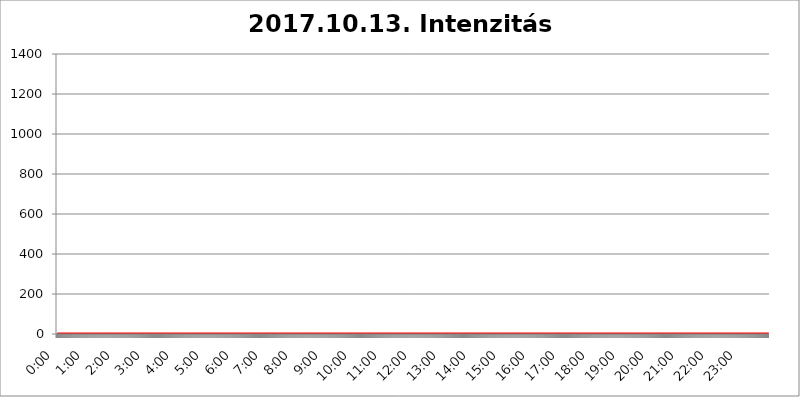
| Category | 2017.10.13. Intenzitás [W/m^2] |
|---|---|
| 0.0 | 0 |
| 0.0006944444444444445 | 0 |
| 0.001388888888888889 | 0 |
| 0.0020833333333333333 | 0 |
| 0.002777777777777778 | 0 |
| 0.003472222222222222 | 0 |
| 0.004166666666666667 | 0 |
| 0.004861111111111111 | 0 |
| 0.005555555555555556 | 0 |
| 0.0062499999999999995 | 0 |
| 0.006944444444444444 | 0 |
| 0.007638888888888889 | 0 |
| 0.008333333333333333 | 0 |
| 0.009027777777777779 | 0 |
| 0.009722222222222222 | 0 |
| 0.010416666666666666 | 0 |
| 0.011111111111111112 | 0 |
| 0.011805555555555555 | 0 |
| 0.012499999999999999 | 0 |
| 0.013194444444444444 | 0 |
| 0.013888888888888888 | 0 |
| 0.014583333333333332 | 0 |
| 0.015277777777777777 | 0 |
| 0.015972222222222224 | 0 |
| 0.016666666666666666 | 0 |
| 0.017361111111111112 | 0 |
| 0.018055555555555557 | 0 |
| 0.01875 | 0 |
| 0.019444444444444445 | 0 |
| 0.02013888888888889 | 0 |
| 0.020833333333333332 | 0 |
| 0.02152777777777778 | 0 |
| 0.022222222222222223 | 0 |
| 0.02291666666666667 | 0 |
| 0.02361111111111111 | 0 |
| 0.024305555555555556 | 0 |
| 0.024999999999999998 | 0 |
| 0.025694444444444447 | 0 |
| 0.02638888888888889 | 0 |
| 0.027083333333333334 | 0 |
| 0.027777777777777776 | 0 |
| 0.02847222222222222 | 0 |
| 0.029166666666666664 | 0 |
| 0.029861111111111113 | 0 |
| 0.030555555555555555 | 0 |
| 0.03125 | 0 |
| 0.03194444444444445 | 0 |
| 0.03263888888888889 | 0 |
| 0.03333333333333333 | 0 |
| 0.034027777777777775 | 0 |
| 0.034722222222222224 | 0 |
| 0.035416666666666666 | 0 |
| 0.036111111111111115 | 0 |
| 0.03680555555555556 | 0 |
| 0.0375 | 0 |
| 0.03819444444444444 | 0 |
| 0.03888888888888889 | 0 |
| 0.03958333333333333 | 0 |
| 0.04027777777777778 | 0 |
| 0.04097222222222222 | 0 |
| 0.041666666666666664 | 0 |
| 0.042361111111111106 | 0 |
| 0.04305555555555556 | 0 |
| 0.043750000000000004 | 0 |
| 0.044444444444444446 | 0 |
| 0.04513888888888889 | 0 |
| 0.04583333333333334 | 0 |
| 0.04652777777777778 | 0 |
| 0.04722222222222222 | 0 |
| 0.04791666666666666 | 0 |
| 0.04861111111111111 | 0 |
| 0.049305555555555554 | 0 |
| 0.049999999999999996 | 0 |
| 0.05069444444444445 | 0 |
| 0.051388888888888894 | 0 |
| 0.052083333333333336 | 0 |
| 0.05277777777777778 | 0 |
| 0.05347222222222222 | 0 |
| 0.05416666666666667 | 0 |
| 0.05486111111111111 | 0 |
| 0.05555555555555555 | 0 |
| 0.05625 | 0 |
| 0.05694444444444444 | 0 |
| 0.057638888888888885 | 0 |
| 0.05833333333333333 | 0 |
| 0.05902777777777778 | 0 |
| 0.059722222222222225 | 0 |
| 0.06041666666666667 | 0 |
| 0.061111111111111116 | 0 |
| 0.06180555555555556 | 0 |
| 0.0625 | 0 |
| 0.06319444444444444 | 0 |
| 0.06388888888888888 | 0 |
| 0.06458333333333334 | 0 |
| 0.06527777777777778 | 0 |
| 0.06597222222222222 | 0 |
| 0.06666666666666667 | 0 |
| 0.06736111111111111 | 0 |
| 0.06805555555555555 | 0 |
| 0.06874999999999999 | 0 |
| 0.06944444444444443 | 0 |
| 0.07013888888888889 | 0 |
| 0.07083333333333333 | 0 |
| 0.07152777777777779 | 0 |
| 0.07222222222222223 | 0 |
| 0.07291666666666667 | 0 |
| 0.07361111111111111 | 0 |
| 0.07430555555555556 | 0 |
| 0.075 | 0 |
| 0.07569444444444444 | 0 |
| 0.0763888888888889 | 0 |
| 0.07708333333333334 | 0 |
| 0.07777777777777778 | 0 |
| 0.07847222222222222 | 0 |
| 0.07916666666666666 | 0 |
| 0.0798611111111111 | 0 |
| 0.08055555555555556 | 0 |
| 0.08125 | 0 |
| 0.08194444444444444 | 0 |
| 0.08263888888888889 | 0 |
| 0.08333333333333333 | 0 |
| 0.08402777777777777 | 0 |
| 0.08472222222222221 | 0 |
| 0.08541666666666665 | 0 |
| 0.08611111111111112 | 0 |
| 0.08680555555555557 | 0 |
| 0.08750000000000001 | 0 |
| 0.08819444444444445 | 0 |
| 0.08888888888888889 | 0 |
| 0.08958333333333333 | 0 |
| 0.09027777777777778 | 0 |
| 0.09097222222222222 | 0 |
| 0.09166666666666667 | 0 |
| 0.09236111111111112 | 0 |
| 0.09305555555555556 | 0 |
| 0.09375 | 0 |
| 0.09444444444444444 | 0 |
| 0.09513888888888888 | 0 |
| 0.09583333333333333 | 0 |
| 0.09652777777777777 | 0 |
| 0.09722222222222222 | 0 |
| 0.09791666666666667 | 0 |
| 0.09861111111111111 | 0 |
| 0.09930555555555555 | 0 |
| 0.09999999999999999 | 0 |
| 0.10069444444444443 | 0 |
| 0.1013888888888889 | 0 |
| 0.10208333333333335 | 0 |
| 0.10277777777777779 | 0 |
| 0.10347222222222223 | 0 |
| 0.10416666666666667 | 0 |
| 0.10486111111111111 | 0 |
| 0.10555555555555556 | 0 |
| 0.10625 | 0 |
| 0.10694444444444444 | 0 |
| 0.1076388888888889 | 0 |
| 0.10833333333333334 | 0 |
| 0.10902777777777778 | 0 |
| 0.10972222222222222 | 0 |
| 0.1111111111111111 | 0 |
| 0.11180555555555556 | 0 |
| 0.11180555555555556 | 0 |
| 0.1125 | 0 |
| 0.11319444444444444 | 0 |
| 0.11388888888888889 | 0 |
| 0.11458333333333333 | 0 |
| 0.11527777777777777 | 0 |
| 0.11597222222222221 | 0 |
| 0.11666666666666665 | 0 |
| 0.1173611111111111 | 0 |
| 0.11805555555555557 | 0 |
| 0.11944444444444445 | 0 |
| 0.12013888888888889 | 0 |
| 0.12083333333333333 | 0 |
| 0.12152777777777778 | 0 |
| 0.12222222222222223 | 0 |
| 0.12291666666666667 | 0 |
| 0.12291666666666667 | 0 |
| 0.12361111111111112 | 0 |
| 0.12430555555555556 | 0 |
| 0.125 | 0 |
| 0.12569444444444444 | 0 |
| 0.12638888888888888 | 0 |
| 0.12708333333333333 | 0 |
| 0.16875 | 0 |
| 0.12847222222222224 | 0 |
| 0.12916666666666668 | 0 |
| 0.12986111111111112 | 0 |
| 0.13055555555555556 | 0 |
| 0.13125 | 0 |
| 0.13194444444444445 | 0 |
| 0.1326388888888889 | 0 |
| 0.13333333333333333 | 0 |
| 0.13402777777777777 | 0 |
| 0.13402777777777777 | 0 |
| 0.13472222222222222 | 0 |
| 0.13541666666666666 | 0 |
| 0.1361111111111111 | 0 |
| 0.13749999999999998 | 0 |
| 0.13819444444444443 | 0 |
| 0.1388888888888889 | 0 |
| 0.13958333333333334 | 0 |
| 0.14027777777777778 | 0 |
| 0.14097222222222222 | 0 |
| 0.14166666666666666 | 0 |
| 0.1423611111111111 | 0 |
| 0.14305555555555557 | 0 |
| 0.14375000000000002 | 0 |
| 0.14444444444444446 | 0 |
| 0.1451388888888889 | 0 |
| 0.1451388888888889 | 0 |
| 0.14652777777777778 | 0 |
| 0.14722222222222223 | 0 |
| 0.14791666666666667 | 0 |
| 0.1486111111111111 | 0 |
| 0.14930555555555555 | 0 |
| 0.15 | 0 |
| 0.15069444444444444 | 0 |
| 0.15138888888888888 | 0 |
| 0.15208333333333332 | 0 |
| 0.15277777777777776 | 0 |
| 0.15347222222222223 | 0 |
| 0.15416666666666667 | 0 |
| 0.15486111111111112 | 0 |
| 0.15555555555555556 | 0 |
| 0.15625 | 0 |
| 0.15694444444444444 | 0 |
| 0.15763888888888888 | 0 |
| 0.15833333333333333 | 0 |
| 0.15902777777777777 | 0 |
| 0.15972222222222224 | 0 |
| 0.16041666666666668 | 0 |
| 0.16111111111111112 | 0 |
| 0.16180555555555556 | 0 |
| 0.1625 | 0 |
| 0.16319444444444445 | 0 |
| 0.1638888888888889 | 0 |
| 0.16458333333333333 | 0 |
| 0.16527777777777777 | 0 |
| 0.16597222222222222 | 0 |
| 0.16666666666666666 | 0 |
| 0.1673611111111111 | 0 |
| 0.16805555555555554 | 0 |
| 0.16874999999999998 | 0 |
| 0.16944444444444443 | 0 |
| 0.17013888888888887 | 0 |
| 0.1708333333333333 | 0 |
| 0.17152777777777775 | 0 |
| 0.17222222222222225 | 0 |
| 0.1729166666666667 | 0 |
| 0.17361111111111113 | 0 |
| 0.17430555555555557 | 0 |
| 0.17500000000000002 | 0 |
| 0.17569444444444446 | 0 |
| 0.1763888888888889 | 0 |
| 0.17708333333333334 | 0 |
| 0.17777777777777778 | 0 |
| 0.17847222222222223 | 0 |
| 0.17916666666666667 | 0 |
| 0.1798611111111111 | 0 |
| 0.18055555555555555 | 0 |
| 0.18125 | 0 |
| 0.18194444444444444 | 0 |
| 0.1826388888888889 | 0 |
| 0.18333333333333335 | 0 |
| 0.1840277777777778 | 0 |
| 0.18472222222222223 | 0 |
| 0.18541666666666667 | 0 |
| 0.18611111111111112 | 0 |
| 0.18680555555555556 | 0 |
| 0.1875 | 0 |
| 0.18819444444444444 | 0 |
| 0.18888888888888888 | 0 |
| 0.18958333333333333 | 0 |
| 0.19027777777777777 | 0 |
| 0.1909722222222222 | 0 |
| 0.19166666666666665 | 0 |
| 0.19236111111111112 | 0 |
| 0.19305555555555554 | 0 |
| 0.19375 | 0 |
| 0.19444444444444445 | 0 |
| 0.1951388888888889 | 0 |
| 0.19583333333333333 | 0 |
| 0.19652777777777777 | 0 |
| 0.19722222222222222 | 0 |
| 0.19791666666666666 | 0 |
| 0.1986111111111111 | 0 |
| 0.19930555555555554 | 0 |
| 0.19999999999999998 | 0 |
| 0.20069444444444443 | 0 |
| 0.20138888888888887 | 0 |
| 0.2020833333333333 | 0 |
| 0.2027777777777778 | 0 |
| 0.2034722222222222 | 0 |
| 0.2041666666666667 | 0 |
| 0.20486111111111113 | 0 |
| 0.20555555555555557 | 0 |
| 0.20625000000000002 | 0 |
| 0.20694444444444446 | 0 |
| 0.2076388888888889 | 0 |
| 0.20833333333333334 | 0 |
| 0.20902777777777778 | 0 |
| 0.20972222222222223 | 0 |
| 0.21041666666666667 | 0 |
| 0.2111111111111111 | 0 |
| 0.21180555555555555 | 0 |
| 0.2125 | 0 |
| 0.21319444444444444 | 0 |
| 0.2138888888888889 | 0 |
| 0.21458333333333335 | 0 |
| 0.2152777777777778 | 0 |
| 0.21597222222222223 | 0 |
| 0.21666666666666667 | 0 |
| 0.21736111111111112 | 0 |
| 0.21805555555555556 | 0 |
| 0.21875 | 0 |
| 0.21944444444444444 | 0 |
| 0.22013888888888888 | 0 |
| 0.22083333333333333 | 0 |
| 0.22152777777777777 | 0 |
| 0.2222222222222222 | 0 |
| 0.22291666666666665 | 0 |
| 0.2236111111111111 | 0 |
| 0.22430555555555556 | 0 |
| 0.225 | 0 |
| 0.22569444444444445 | 0 |
| 0.2263888888888889 | 0 |
| 0.22708333333333333 | 0 |
| 0.22777777777777777 | 0 |
| 0.22847222222222222 | 0 |
| 0.22916666666666666 | 0 |
| 0.2298611111111111 | 0 |
| 0.23055555555555554 | 0 |
| 0.23124999999999998 | 0 |
| 0.23194444444444443 | 0 |
| 0.23263888888888887 | 0 |
| 0.2333333333333333 | 0 |
| 0.2340277777777778 | 0 |
| 0.2347222222222222 | 0 |
| 0.2354166666666667 | 0 |
| 0.23611111111111113 | 0 |
| 0.23680555555555557 | 0 |
| 0.23750000000000002 | 0 |
| 0.23819444444444446 | 0 |
| 0.2388888888888889 | 0 |
| 0.23958333333333334 | 0 |
| 0.24027777777777778 | 0 |
| 0.24097222222222223 | 0 |
| 0.24166666666666667 | 0 |
| 0.2423611111111111 | 0 |
| 0.24305555555555555 | 0 |
| 0.24375 | 0 |
| 0.24444444444444446 | 0 |
| 0.24513888888888888 | 0 |
| 0.24583333333333335 | 0 |
| 0.2465277777777778 | 0 |
| 0.24722222222222223 | 0 |
| 0.24791666666666667 | 0 |
| 0.24861111111111112 | 0 |
| 0.24930555555555556 | 0 |
| 0.25 | 0 |
| 0.25069444444444444 | 0 |
| 0.2513888888888889 | 0 |
| 0.2520833333333333 | 0 |
| 0.25277777777777777 | 0 |
| 0.2534722222222222 | 0 |
| 0.25416666666666665 | 0 |
| 0.2548611111111111 | 0 |
| 0.2555555555555556 | 0 |
| 0.25625000000000003 | 0 |
| 0.2569444444444445 | 0 |
| 0.2576388888888889 | 0 |
| 0.25833333333333336 | 0 |
| 0.2590277777777778 | 0 |
| 0.25972222222222224 | 0 |
| 0.2604166666666667 | 0 |
| 0.2611111111111111 | 0 |
| 0.26180555555555557 | 0 |
| 0.2625 | 0 |
| 0.26319444444444445 | 0 |
| 0.2638888888888889 | 0 |
| 0.26458333333333334 | 0 |
| 0.2652777777777778 | 0 |
| 0.2659722222222222 | 0 |
| 0.26666666666666666 | 0 |
| 0.2673611111111111 | 0 |
| 0.26805555555555555 | 0 |
| 0.26875 | 0 |
| 0.26944444444444443 | 0 |
| 0.2701388888888889 | 0 |
| 0.2708333333333333 | 0 |
| 0.27152777777777776 | 0 |
| 0.2722222222222222 | 0 |
| 0.27291666666666664 | 0 |
| 0.2736111111111111 | 0 |
| 0.2743055555555555 | 0 |
| 0.27499999999999997 | 0 |
| 0.27569444444444446 | 0 |
| 0.27638888888888885 | 0 |
| 0.27708333333333335 | 0 |
| 0.2777777777777778 | 0 |
| 0.27847222222222223 | 0 |
| 0.2791666666666667 | 0 |
| 0.2798611111111111 | 0 |
| 0.28055555555555556 | 0 |
| 0.28125 | 0 |
| 0.28194444444444444 | 0 |
| 0.2826388888888889 | 0 |
| 0.2833333333333333 | 0 |
| 0.28402777777777777 | 0 |
| 0.2847222222222222 | 0 |
| 0.28541666666666665 | 0 |
| 0.28611111111111115 | 0 |
| 0.28680555555555554 | 0 |
| 0.28750000000000003 | 0 |
| 0.2881944444444445 | 0 |
| 0.2888888888888889 | 0 |
| 0.28958333333333336 | 0 |
| 0.2902777777777778 | 0 |
| 0.29097222222222224 | 0 |
| 0.2916666666666667 | 0 |
| 0.2923611111111111 | 0 |
| 0.29305555555555557 | 0 |
| 0.29375 | 0 |
| 0.29444444444444445 | 0 |
| 0.2951388888888889 | 0 |
| 0.29583333333333334 | 0 |
| 0.2965277777777778 | 0 |
| 0.2972222222222222 | 0 |
| 0.29791666666666666 | 0 |
| 0.2986111111111111 | 0 |
| 0.29930555555555555 | 0 |
| 0.3 | 0 |
| 0.30069444444444443 | 0 |
| 0.3013888888888889 | 0 |
| 0.3020833333333333 | 0 |
| 0.30277777777777776 | 0 |
| 0.3034722222222222 | 0 |
| 0.30416666666666664 | 0 |
| 0.3048611111111111 | 0 |
| 0.3055555555555555 | 0 |
| 0.30624999999999997 | 0 |
| 0.3069444444444444 | 0 |
| 0.3076388888888889 | 0 |
| 0.30833333333333335 | 0 |
| 0.3090277777777778 | 0 |
| 0.30972222222222223 | 0 |
| 0.3104166666666667 | 0 |
| 0.3111111111111111 | 0 |
| 0.31180555555555556 | 0 |
| 0.3125 | 0 |
| 0.31319444444444444 | 0 |
| 0.3138888888888889 | 0 |
| 0.3145833333333333 | 0 |
| 0.31527777777777777 | 0 |
| 0.3159722222222222 | 0 |
| 0.31666666666666665 | 0 |
| 0.31736111111111115 | 0 |
| 0.31805555555555554 | 0 |
| 0.31875000000000003 | 0 |
| 0.3194444444444445 | 0 |
| 0.3201388888888889 | 0 |
| 0.32083333333333336 | 0 |
| 0.3215277777777778 | 0 |
| 0.32222222222222224 | 0 |
| 0.3229166666666667 | 0 |
| 0.3236111111111111 | 0 |
| 0.32430555555555557 | 0 |
| 0.325 | 0 |
| 0.32569444444444445 | 0 |
| 0.3263888888888889 | 0 |
| 0.32708333333333334 | 0 |
| 0.3277777777777778 | 0 |
| 0.3284722222222222 | 0 |
| 0.32916666666666666 | 0 |
| 0.3298611111111111 | 0 |
| 0.33055555555555555 | 0 |
| 0.33125 | 0 |
| 0.33194444444444443 | 0 |
| 0.3326388888888889 | 0 |
| 0.3333333333333333 | 0 |
| 0.3340277777777778 | 0 |
| 0.3347222222222222 | 0 |
| 0.3354166666666667 | 0 |
| 0.3361111111111111 | 0 |
| 0.3368055555555556 | 0 |
| 0.33749999999999997 | 0 |
| 0.33819444444444446 | 0 |
| 0.33888888888888885 | 0 |
| 0.33958333333333335 | 0 |
| 0.34027777777777773 | 0 |
| 0.34097222222222223 | 0 |
| 0.3416666666666666 | 0 |
| 0.3423611111111111 | 0 |
| 0.3430555555555555 | 0 |
| 0.34375 | 0 |
| 0.3444444444444445 | 0 |
| 0.3451388888888889 | 0 |
| 0.3458333333333334 | 0 |
| 0.34652777777777777 | 0 |
| 0.34722222222222227 | 0 |
| 0.34791666666666665 | 0 |
| 0.34861111111111115 | 0 |
| 0.34930555555555554 | 0 |
| 0.35000000000000003 | 0 |
| 0.3506944444444444 | 0 |
| 0.3513888888888889 | 0 |
| 0.3520833333333333 | 0 |
| 0.3527777777777778 | 0 |
| 0.3534722222222222 | 0 |
| 0.3541666666666667 | 0 |
| 0.3548611111111111 | 0 |
| 0.35555555555555557 | 0 |
| 0.35625 | 0 |
| 0.35694444444444445 | 0 |
| 0.3576388888888889 | 0 |
| 0.35833333333333334 | 0 |
| 0.3590277777777778 | 0 |
| 0.3597222222222222 | 0 |
| 0.36041666666666666 | 0 |
| 0.3611111111111111 | 0 |
| 0.36180555555555555 | 0 |
| 0.3625 | 0 |
| 0.36319444444444443 | 0 |
| 0.3638888888888889 | 0 |
| 0.3645833333333333 | 0 |
| 0.3652777777777778 | 0 |
| 0.3659722222222222 | 0 |
| 0.3666666666666667 | 0 |
| 0.3673611111111111 | 0 |
| 0.3680555555555556 | 0 |
| 0.36874999999999997 | 0 |
| 0.36944444444444446 | 0 |
| 0.37013888888888885 | 0 |
| 0.37083333333333335 | 0 |
| 0.37152777777777773 | 0 |
| 0.37222222222222223 | 0 |
| 0.3729166666666666 | 0 |
| 0.3736111111111111 | 0 |
| 0.3743055555555555 | 0 |
| 0.375 | 0 |
| 0.3756944444444445 | 0 |
| 0.3763888888888889 | 0 |
| 0.3770833333333334 | 0 |
| 0.37777777777777777 | 0 |
| 0.37847222222222227 | 0 |
| 0.37916666666666665 | 0 |
| 0.37986111111111115 | 0 |
| 0.38055555555555554 | 0 |
| 0.38125000000000003 | 0 |
| 0.3819444444444444 | 0 |
| 0.3826388888888889 | 0 |
| 0.3833333333333333 | 0 |
| 0.3840277777777778 | 0 |
| 0.3847222222222222 | 0 |
| 0.3854166666666667 | 0 |
| 0.3861111111111111 | 0 |
| 0.38680555555555557 | 0 |
| 0.3875 | 0 |
| 0.38819444444444445 | 0 |
| 0.3888888888888889 | 0 |
| 0.38958333333333334 | 0 |
| 0.3902777777777778 | 0 |
| 0.3909722222222222 | 0 |
| 0.39166666666666666 | 0 |
| 0.3923611111111111 | 0 |
| 0.39305555555555555 | 0 |
| 0.39375 | 0 |
| 0.39444444444444443 | 0 |
| 0.3951388888888889 | 0 |
| 0.3958333333333333 | 0 |
| 0.3965277777777778 | 0 |
| 0.3972222222222222 | 0 |
| 0.3979166666666667 | 0 |
| 0.3986111111111111 | 0 |
| 0.3993055555555556 | 0 |
| 0.39999999999999997 | 0 |
| 0.40069444444444446 | 0 |
| 0.40138888888888885 | 0 |
| 0.40208333333333335 | 0 |
| 0.40277777777777773 | 0 |
| 0.40347222222222223 | 0 |
| 0.4041666666666666 | 0 |
| 0.4048611111111111 | 0 |
| 0.4055555555555555 | 0 |
| 0.40625 | 0 |
| 0.4069444444444445 | 0 |
| 0.4076388888888889 | 0 |
| 0.4083333333333334 | 0 |
| 0.40902777777777777 | 0 |
| 0.40972222222222227 | 0 |
| 0.41041666666666665 | 0 |
| 0.41111111111111115 | 0 |
| 0.41180555555555554 | 0 |
| 0.41250000000000003 | 0 |
| 0.4131944444444444 | 0 |
| 0.4138888888888889 | 0 |
| 0.4145833333333333 | 0 |
| 0.4152777777777778 | 0 |
| 0.4159722222222222 | 0 |
| 0.4166666666666667 | 0 |
| 0.4173611111111111 | 0 |
| 0.41805555555555557 | 0 |
| 0.41875 | 0 |
| 0.41944444444444445 | 0 |
| 0.4201388888888889 | 0 |
| 0.42083333333333334 | 0 |
| 0.4215277777777778 | 0 |
| 0.4222222222222222 | 0 |
| 0.42291666666666666 | 0 |
| 0.4236111111111111 | 0 |
| 0.42430555555555555 | 0 |
| 0.425 | 0 |
| 0.42569444444444443 | 0 |
| 0.4263888888888889 | 0 |
| 0.4270833333333333 | 0 |
| 0.4277777777777778 | 0 |
| 0.4284722222222222 | 0 |
| 0.4291666666666667 | 0 |
| 0.4298611111111111 | 0 |
| 0.4305555555555556 | 0 |
| 0.43124999999999997 | 0 |
| 0.43194444444444446 | 0 |
| 0.43263888888888885 | 0 |
| 0.43333333333333335 | 0 |
| 0.43402777777777773 | 0 |
| 0.43472222222222223 | 0 |
| 0.4354166666666666 | 0 |
| 0.4361111111111111 | 0 |
| 0.4368055555555555 | 0 |
| 0.4375 | 0 |
| 0.4381944444444445 | 0 |
| 0.4388888888888889 | 0 |
| 0.4395833333333334 | 0 |
| 0.44027777777777777 | 0 |
| 0.44097222222222227 | 0 |
| 0.44166666666666665 | 0 |
| 0.44236111111111115 | 0 |
| 0.44305555555555554 | 0 |
| 0.44375000000000003 | 0 |
| 0.4444444444444444 | 0 |
| 0.4451388888888889 | 0 |
| 0.4458333333333333 | 0 |
| 0.4465277777777778 | 0 |
| 0.4472222222222222 | 0 |
| 0.4479166666666667 | 0 |
| 0.4486111111111111 | 0 |
| 0.44930555555555557 | 0 |
| 0.45 | 0 |
| 0.45069444444444445 | 0 |
| 0.4513888888888889 | 0 |
| 0.45208333333333334 | 0 |
| 0.4527777777777778 | 0 |
| 0.4534722222222222 | 0 |
| 0.45416666666666666 | 0 |
| 0.4548611111111111 | 0 |
| 0.45555555555555555 | 0 |
| 0.45625 | 0 |
| 0.45694444444444443 | 0 |
| 0.4576388888888889 | 0 |
| 0.4583333333333333 | 0 |
| 0.4590277777777778 | 0 |
| 0.4597222222222222 | 0 |
| 0.4604166666666667 | 0 |
| 0.4611111111111111 | 0 |
| 0.4618055555555556 | 0 |
| 0.46249999999999997 | 0 |
| 0.46319444444444446 | 0 |
| 0.46388888888888885 | 0 |
| 0.46458333333333335 | 0 |
| 0.46527777777777773 | 0 |
| 0.46597222222222223 | 0 |
| 0.4666666666666666 | 0 |
| 0.4673611111111111 | 0 |
| 0.4680555555555555 | 0 |
| 0.46875 | 0 |
| 0.4694444444444445 | 0 |
| 0.4701388888888889 | 0 |
| 0.4708333333333334 | 0 |
| 0.47152777777777777 | 0 |
| 0.47222222222222227 | 0 |
| 0.47291666666666665 | 0 |
| 0.47361111111111115 | 0 |
| 0.47430555555555554 | 0 |
| 0.47500000000000003 | 0 |
| 0.4756944444444444 | 0 |
| 0.4763888888888889 | 0 |
| 0.4770833333333333 | 0 |
| 0.4777777777777778 | 0 |
| 0.4784722222222222 | 0 |
| 0.4791666666666667 | 0 |
| 0.4798611111111111 | 0 |
| 0.48055555555555557 | 0 |
| 0.48125 | 0 |
| 0.48194444444444445 | 0 |
| 0.4826388888888889 | 0 |
| 0.48333333333333334 | 0 |
| 0.4840277777777778 | 0 |
| 0.4847222222222222 | 0 |
| 0.48541666666666666 | 0 |
| 0.4861111111111111 | 0 |
| 0.48680555555555555 | 0 |
| 0.4875 | 0 |
| 0.48819444444444443 | 0 |
| 0.4888888888888889 | 0 |
| 0.4895833333333333 | 0 |
| 0.4902777777777778 | 0 |
| 0.4909722222222222 | 0 |
| 0.4916666666666667 | 0 |
| 0.4923611111111111 | 0 |
| 0.4930555555555556 | 0 |
| 0.49374999999999997 | 0 |
| 0.49444444444444446 | 0 |
| 0.49513888888888885 | 0 |
| 0.49583333333333335 | 0 |
| 0.49652777777777773 | 0 |
| 0.49722222222222223 | 0 |
| 0.4979166666666666 | 0 |
| 0.4986111111111111 | 0 |
| 0.4993055555555555 | 0 |
| 0.5 | 0 |
| 0.5006944444444444 | 0 |
| 0.5013888888888889 | 0 |
| 0.5020833333333333 | 0 |
| 0.5027777777777778 | 0 |
| 0.5034722222222222 | 0 |
| 0.5041666666666667 | 0 |
| 0.5048611111111111 | 0 |
| 0.5055555555555555 | 0 |
| 0.50625 | 0 |
| 0.5069444444444444 | 0 |
| 0.5076388888888889 | 0 |
| 0.5083333333333333 | 0 |
| 0.5090277777777777 | 0 |
| 0.5097222222222222 | 0 |
| 0.5104166666666666 | 0 |
| 0.5111111111111112 | 0 |
| 0.5118055555555555 | 0 |
| 0.5125000000000001 | 0 |
| 0.5131944444444444 | 0 |
| 0.513888888888889 | 0 |
| 0.5145833333333333 | 0 |
| 0.5152777777777778 | 0 |
| 0.5159722222222222 | 0 |
| 0.5166666666666667 | 0 |
| 0.517361111111111 | 0 |
| 0.5180555555555556 | 0 |
| 0.5187499999999999 | 0 |
| 0.5194444444444445 | 0 |
| 0.5201388888888888 | 0 |
| 0.5208333333333334 | 0 |
| 0.5215277777777778 | 0 |
| 0.5222222222222223 | 0 |
| 0.5229166666666667 | 0 |
| 0.5236111111111111 | 0 |
| 0.5243055555555556 | 0 |
| 0.525 | 0 |
| 0.5256944444444445 | 0 |
| 0.5263888888888889 | 0 |
| 0.5270833333333333 | 0 |
| 0.5277777777777778 | 0 |
| 0.5284722222222222 | 0 |
| 0.5291666666666667 | 0 |
| 0.5298611111111111 | 0 |
| 0.5305555555555556 | 0 |
| 0.53125 | 0 |
| 0.5319444444444444 | 0 |
| 0.5326388888888889 | 0 |
| 0.5333333333333333 | 0 |
| 0.5340277777777778 | 0 |
| 0.5347222222222222 | 0 |
| 0.5354166666666667 | 0 |
| 0.5361111111111111 | 0 |
| 0.5368055555555555 | 0 |
| 0.5375 | 0 |
| 0.5381944444444444 | 0 |
| 0.5388888888888889 | 0 |
| 0.5395833333333333 | 0 |
| 0.5402777777777777 | 0 |
| 0.5409722222222222 | 0 |
| 0.5416666666666666 | 0 |
| 0.5423611111111112 | 0 |
| 0.5430555555555555 | 0 |
| 0.5437500000000001 | 0 |
| 0.5444444444444444 | 0 |
| 0.545138888888889 | 0 |
| 0.5458333333333333 | 0 |
| 0.5465277777777778 | 0 |
| 0.5472222222222222 | 0 |
| 0.5479166666666667 | 0 |
| 0.548611111111111 | 0 |
| 0.5493055555555556 | 0 |
| 0.5499999999999999 | 0 |
| 0.5506944444444445 | 0 |
| 0.5513888888888888 | 0 |
| 0.5520833333333334 | 0 |
| 0.5527777777777778 | 0 |
| 0.5534722222222223 | 0 |
| 0.5541666666666667 | 0 |
| 0.5548611111111111 | 0 |
| 0.5555555555555556 | 0 |
| 0.55625 | 0 |
| 0.5569444444444445 | 0 |
| 0.5576388888888889 | 0 |
| 0.5583333333333333 | 0 |
| 0.5590277777777778 | 0 |
| 0.5597222222222222 | 0 |
| 0.5604166666666667 | 0 |
| 0.5611111111111111 | 0 |
| 0.5618055555555556 | 0 |
| 0.5625 | 0 |
| 0.5631944444444444 | 0 |
| 0.5638888888888889 | 0 |
| 0.5645833333333333 | 0 |
| 0.5652777777777778 | 0 |
| 0.5659722222222222 | 0 |
| 0.5666666666666667 | 0 |
| 0.5673611111111111 | 0 |
| 0.5680555555555555 | 0 |
| 0.56875 | 0 |
| 0.5694444444444444 | 0 |
| 0.5701388888888889 | 0 |
| 0.5708333333333333 | 0 |
| 0.5715277777777777 | 0 |
| 0.5722222222222222 | 0 |
| 0.5729166666666666 | 0 |
| 0.5736111111111112 | 0 |
| 0.5743055555555555 | 0 |
| 0.5750000000000001 | 0 |
| 0.5756944444444444 | 0 |
| 0.576388888888889 | 0 |
| 0.5770833333333333 | 0 |
| 0.5777777777777778 | 0 |
| 0.5784722222222222 | 0 |
| 0.5791666666666667 | 0 |
| 0.579861111111111 | 0 |
| 0.5805555555555556 | 0 |
| 0.5812499999999999 | 0 |
| 0.5819444444444445 | 0 |
| 0.5826388888888888 | 0 |
| 0.5833333333333334 | 0 |
| 0.5840277777777778 | 0 |
| 0.5847222222222223 | 0 |
| 0.5854166666666667 | 0 |
| 0.5861111111111111 | 0 |
| 0.5868055555555556 | 0 |
| 0.5875 | 0 |
| 0.5881944444444445 | 0 |
| 0.5888888888888889 | 0 |
| 0.5895833333333333 | 0 |
| 0.5902777777777778 | 0 |
| 0.5909722222222222 | 0 |
| 0.5916666666666667 | 0 |
| 0.5923611111111111 | 0 |
| 0.5930555555555556 | 0 |
| 0.59375 | 0 |
| 0.5944444444444444 | 0 |
| 0.5951388888888889 | 0 |
| 0.5958333333333333 | 0 |
| 0.5965277777777778 | 0 |
| 0.5972222222222222 | 0 |
| 0.5979166666666667 | 0 |
| 0.5986111111111111 | 0 |
| 0.5993055555555555 | 0 |
| 0.6 | 0 |
| 0.6006944444444444 | 0 |
| 0.6013888888888889 | 0 |
| 0.6020833333333333 | 0 |
| 0.6027777777777777 | 0 |
| 0.6034722222222222 | 0 |
| 0.6041666666666666 | 0 |
| 0.6048611111111112 | 0 |
| 0.6055555555555555 | 0 |
| 0.6062500000000001 | 0 |
| 0.6069444444444444 | 0 |
| 0.607638888888889 | 0 |
| 0.6083333333333333 | 0 |
| 0.6090277777777778 | 0 |
| 0.6097222222222222 | 0 |
| 0.6104166666666667 | 0 |
| 0.611111111111111 | 0 |
| 0.6118055555555556 | 0 |
| 0.6124999999999999 | 0 |
| 0.6131944444444445 | 0 |
| 0.6138888888888888 | 0 |
| 0.6145833333333334 | 0 |
| 0.6152777777777778 | 0 |
| 0.6159722222222223 | 0 |
| 0.6166666666666667 | 0 |
| 0.6173611111111111 | 0 |
| 0.6180555555555556 | 0 |
| 0.61875 | 0 |
| 0.6194444444444445 | 0 |
| 0.6201388888888889 | 0 |
| 0.6208333333333333 | 0 |
| 0.6215277777777778 | 0 |
| 0.6222222222222222 | 0 |
| 0.6229166666666667 | 0 |
| 0.6236111111111111 | 0 |
| 0.6243055555555556 | 0 |
| 0.625 | 0 |
| 0.6256944444444444 | 0 |
| 0.6263888888888889 | 0 |
| 0.6270833333333333 | 0 |
| 0.6277777777777778 | 0 |
| 0.6284722222222222 | 0 |
| 0.6291666666666667 | 0 |
| 0.6298611111111111 | 0 |
| 0.6305555555555555 | 0 |
| 0.63125 | 0 |
| 0.6319444444444444 | 0 |
| 0.6326388888888889 | 0 |
| 0.6333333333333333 | 0 |
| 0.6340277777777777 | 0 |
| 0.6347222222222222 | 0 |
| 0.6354166666666666 | 0 |
| 0.6361111111111112 | 0 |
| 0.6368055555555555 | 0 |
| 0.6375000000000001 | 0 |
| 0.6381944444444444 | 0 |
| 0.638888888888889 | 0 |
| 0.6395833333333333 | 0 |
| 0.6402777777777778 | 0 |
| 0.6409722222222222 | 0 |
| 0.6416666666666667 | 0 |
| 0.642361111111111 | 0 |
| 0.6430555555555556 | 0 |
| 0.6437499999999999 | 0 |
| 0.6444444444444445 | 0 |
| 0.6451388888888888 | 0 |
| 0.6458333333333334 | 0 |
| 0.6465277777777778 | 0 |
| 0.6472222222222223 | 0 |
| 0.6479166666666667 | 0 |
| 0.6486111111111111 | 0 |
| 0.6493055555555556 | 0 |
| 0.65 | 0 |
| 0.6506944444444445 | 0 |
| 0.6513888888888889 | 0 |
| 0.6520833333333333 | 0 |
| 0.6527777777777778 | 0 |
| 0.6534722222222222 | 0 |
| 0.6541666666666667 | 0 |
| 0.6548611111111111 | 0 |
| 0.6555555555555556 | 0 |
| 0.65625 | 0 |
| 0.6569444444444444 | 0 |
| 0.6576388888888889 | 0 |
| 0.6583333333333333 | 0 |
| 0.6590277777777778 | 0 |
| 0.6597222222222222 | 0 |
| 0.6604166666666667 | 0 |
| 0.6611111111111111 | 0 |
| 0.6618055555555555 | 0 |
| 0.6625 | 0 |
| 0.6631944444444444 | 0 |
| 0.6638888888888889 | 0 |
| 0.6645833333333333 | 0 |
| 0.6652777777777777 | 0 |
| 0.6659722222222222 | 0 |
| 0.6666666666666666 | 0 |
| 0.6673611111111111 | 0 |
| 0.6680555555555556 | 0 |
| 0.6687500000000001 | 0 |
| 0.6694444444444444 | 0 |
| 0.6701388888888888 | 0 |
| 0.6708333333333334 | 0 |
| 0.6715277777777778 | 0 |
| 0.6722222222222222 | 0 |
| 0.6729166666666666 | 0 |
| 0.6736111111111112 | 0 |
| 0.6743055555555556 | 0 |
| 0.6749999999999999 | 0 |
| 0.6756944444444444 | 0 |
| 0.6763888888888889 | 0 |
| 0.6770833333333334 | 0 |
| 0.6777777777777777 | 0 |
| 0.6784722222222223 | 0 |
| 0.6791666666666667 | 0 |
| 0.6798611111111111 | 0 |
| 0.6805555555555555 | 0 |
| 0.68125 | 0 |
| 0.6819444444444445 | 0 |
| 0.6826388888888889 | 0 |
| 0.6833333333333332 | 0 |
| 0.6840277777777778 | 0 |
| 0.6847222222222222 | 0 |
| 0.6854166666666667 | 0 |
| 0.686111111111111 | 0 |
| 0.6868055555555556 | 0 |
| 0.6875 | 0 |
| 0.6881944444444444 | 0 |
| 0.688888888888889 | 0 |
| 0.6895833333333333 | 0 |
| 0.6902777777777778 | 0 |
| 0.6909722222222222 | 0 |
| 0.6916666666666668 | 0 |
| 0.6923611111111111 | 0 |
| 0.6930555555555555 | 0 |
| 0.69375 | 0 |
| 0.6944444444444445 | 0 |
| 0.6951388888888889 | 0 |
| 0.6958333333333333 | 0 |
| 0.6965277777777777 | 0 |
| 0.6972222222222223 | 0 |
| 0.6979166666666666 | 0 |
| 0.6986111111111111 | 0 |
| 0.6993055555555556 | 0 |
| 0.7000000000000001 | 0 |
| 0.7006944444444444 | 0 |
| 0.7013888888888888 | 0 |
| 0.7020833333333334 | 0 |
| 0.7027777777777778 | 0 |
| 0.7034722222222222 | 0 |
| 0.7041666666666666 | 0 |
| 0.7048611111111112 | 0 |
| 0.7055555555555556 | 0 |
| 0.7062499999999999 | 0 |
| 0.7069444444444444 | 0 |
| 0.7076388888888889 | 0 |
| 0.7083333333333334 | 0 |
| 0.7090277777777777 | 0 |
| 0.7097222222222223 | 0 |
| 0.7104166666666667 | 0 |
| 0.7111111111111111 | 0 |
| 0.7118055555555555 | 0 |
| 0.7125 | 0 |
| 0.7131944444444445 | 0 |
| 0.7138888888888889 | 0 |
| 0.7145833333333332 | 0 |
| 0.7152777777777778 | 0 |
| 0.7159722222222222 | 0 |
| 0.7166666666666667 | 0 |
| 0.717361111111111 | 0 |
| 0.7180555555555556 | 0 |
| 0.71875 | 0 |
| 0.7194444444444444 | 0 |
| 0.720138888888889 | 0 |
| 0.7208333333333333 | 0 |
| 0.7215277777777778 | 0 |
| 0.7222222222222222 | 0 |
| 0.7229166666666668 | 0 |
| 0.7236111111111111 | 0 |
| 0.7243055555555555 | 0 |
| 0.725 | 0 |
| 0.7256944444444445 | 0 |
| 0.7263888888888889 | 0 |
| 0.7270833333333333 | 0 |
| 0.7277777777777777 | 0 |
| 0.7284722222222223 | 0 |
| 0.7291666666666666 | 0 |
| 0.7298611111111111 | 0 |
| 0.7305555555555556 | 0 |
| 0.7312500000000001 | 0 |
| 0.7319444444444444 | 0 |
| 0.7326388888888888 | 0 |
| 0.7333333333333334 | 0 |
| 0.7340277777777778 | 0 |
| 0.7347222222222222 | 0 |
| 0.7354166666666666 | 0 |
| 0.7361111111111112 | 0 |
| 0.7368055555555556 | 0 |
| 0.7374999999999999 | 0 |
| 0.7381944444444444 | 0 |
| 0.7388888888888889 | 0 |
| 0.7395833333333334 | 0 |
| 0.7402777777777777 | 0 |
| 0.7409722222222223 | 0 |
| 0.7416666666666667 | 0 |
| 0.7423611111111111 | 0 |
| 0.7430555555555555 | 0 |
| 0.74375 | 0 |
| 0.7444444444444445 | 0 |
| 0.7451388888888889 | 0 |
| 0.7458333333333332 | 0 |
| 0.7465277777777778 | 0 |
| 0.7472222222222222 | 0 |
| 0.7479166666666667 | 0 |
| 0.748611111111111 | 0 |
| 0.7493055555555556 | 0 |
| 0.75 | 0 |
| 0.7506944444444444 | 0 |
| 0.751388888888889 | 0 |
| 0.7520833333333333 | 0 |
| 0.7527777777777778 | 0 |
| 0.7534722222222222 | 0 |
| 0.7541666666666668 | 0 |
| 0.7548611111111111 | 0 |
| 0.7555555555555555 | 0 |
| 0.75625 | 0 |
| 0.7569444444444445 | 0 |
| 0.7576388888888889 | 0 |
| 0.7583333333333333 | 0 |
| 0.7590277777777777 | 0 |
| 0.7597222222222223 | 0 |
| 0.7604166666666666 | 0 |
| 0.7611111111111111 | 0 |
| 0.7618055555555556 | 0 |
| 0.7625000000000001 | 0 |
| 0.7631944444444444 | 0 |
| 0.7638888888888888 | 0 |
| 0.7645833333333334 | 0 |
| 0.7652777777777778 | 0 |
| 0.7659722222222222 | 0 |
| 0.7666666666666666 | 0 |
| 0.7673611111111112 | 0 |
| 0.7680555555555556 | 0 |
| 0.7687499999999999 | 0 |
| 0.7694444444444444 | 0 |
| 0.7701388888888889 | 0 |
| 0.7708333333333334 | 0 |
| 0.7715277777777777 | 0 |
| 0.7722222222222223 | 0 |
| 0.7729166666666667 | 0 |
| 0.7736111111111111 | 0 |
| 0.7743055555555555 | 0 |
| 0.775 | 0 |
| 0.7756944444444445 | 0 |
| 0.7763888888888889 | 0 |
| 0.7770833333333332 | 0 |
| 0.7777777777777778 | 0 |
| 0.7784722222222222 | 0 |
| 0.7791666666666667 | 0 |
| 0.779861111111111 | 0 |
| 0.7805555555555556 | 0 |
| 0.78125 | 0 |
| 0.7819444444444444 | 0 |
| 0.782638888888889 | 0 |
| 0.7833333333333333 | 0 |
| 0.7840277777777778 | 0 |
| 0.7847222222222222 | 0 |
| 0.7854166666666668 | 0 |
| 0.7861111111111111 | 0 |
| 0.7868055555555555 | 0 |
| 0.7875 | 0 |
| 0.7881944444444445 | 0 |
| 0.7888888888888889 | 0 |
| 0.7895833333333333 | 0 |
| 0.7902777777777777 | 0 |
| 0.7909722222222223 | 0 |
| 0.7916666666666666 | 0 |
| 0.7923611111111111 | 0 |
| 0.7930555555555556 | 0 |
| 0.7937500000000001 | 0 |
| 0.7944444444444444 | 0 |
| 0.7951388888888888 | 0 |
| 0.7958333333333334 | 0 |
| 0.7965277777777778 | 0 |
| 0.7972222222222222 | 0 |
| 0.7979166666666666 | 0 |
| 0.7986111111111112 | 0 |
| 0.7993055555555556 | 0 |
| 0.7999999999999999 | 0 |
| 0.8006944444444444 | 0 |
| 0.8013888888888889 | 0 |
| 0.8020833333333334 | 0 |
| 0.8027777777777777 | 0 |
| 0.8034722222222223 | 0 |
| 0.8041666666666667 | 0 |
| 0.8048611111111111 | 0 |
| 0.8055555555555555 | 0 |
| 0.80625 | 0 |
| 0.8069444444444445 | 0 |
| 0.8076388888888889 | 0 |
| 0.8083333333333332 | 0 |
| 0.8090277777777778 | 0 |
| 0.8097222222222222 | 0 |
| 0.8104166666666667 | 0 |
| 0.811111111111111 | 0 |
| 0.8118055555555556 | 0 |
| 0.8125 | 0 |
| 0.8131944444444444 | 0 |
| 0.813888888888889 | 0 |
| 0.8145833333333333 | 0 |
| 0.8152777777777778 | 0 |
| 0.8159722222222222 | 0 |
| 0.8166666666666668 | 0 |
| 0.8173611111111111 | 0 |
| 0.8180555555555555 | 0 |
| 0.81875 | 0 |
| 0.8194444444444445 | 0 |
| 0.8201388888888889 | 0 |
| 0.8208333333333333 | 0 |
| 0.8215277777777777 | 0 |
| 0.8222222222222223 | 0 |
| 0.8229166666666666 | 0 |
| 0.8236111111111111 | 0 |
| 0.8243055555555556 | 0 |
| 0.8250000000000001 | 0 |
| 0.8256944444444444 | 0 |
| 0.8263888888888888 | 0 |
| 0.8270833333333334 | 0 |
| 0.8277777777777778 | 0 |
| 0.8284722222222222 | 0 |
| 0.8291666666666666 | 0 |
| 0.8298611111111112 | 0 |
| 0.8305555555555556 | 0 |
| 0.8312499999999999 | 0 |
| 0.8319444444444444 | 0 |
| 0.8326388888888889 | 0 |
| 0.8333333333333334 | 0 |
| 0.8340277777777777 | 0 |
| 0.8347222222222223 | 0 |
| 0.8354166666666667 | 0 |
| 0.8361111111111111 | 0 |
| 0.8368055555555555 | 0 |
| 0.8375 | 0 |
| 0.8381944444444445 | 0 |
| 0.8388888888888889 | 0 |
| 0.8395833333333332 | 0 |
| 0.8402777777777778 | 0 |
| 0.8409722222222222 | 0 |
| 0.8416666666666667 | 0 |
| 0.842361111111111 | 0 |
| 0.8430555555555556 | 0 |
| 0.84375 | 0 |
| 0.8444444444444444 | 0 |
| 0.845138888888889 | 0 |
| 0.8458333333333333 | 0 |
| 0.8465277777777778 | 0 |
| 0.8472222222222222 | 0 |
| 0.8479166666666668 | 0 |
| 0.8486111111111111 | 0 |
| 0.8493055555555555 | 0 |
| 0.85 | 0 |
| 0.8506944444444445 | 0 |
| 0.8513888888888889 | 0 |
| 0.8520833333333333 | 0 |
| 0.8527777777777777 | 0 |
| 0.8534722222222223 | 0 |
| 0.8541666666666666 | 0 |
| 0.8548611111111111 | 0 |
| 0.8555555555555556 | 0 |
| 0.8562500000000001 | 0 |
| 0.8569444444444444 | 0 |
| 0.8576388888888888 | 0 |
| 0.8583333333333334 | 0 |
| 0.8590277777777778 | 0 |
| 0.8597222222222222 | 0 |
| 0.8604166666666666 | 0 |
| 0.8611111111111112 | 0 |
| 0.8618055555555556 | 0 |
| 0.8624999999999999 | 0 |
| 0.8631944444444444 | 0 |
| 0.8638888888888889 | 0 |
| 0.8645833333333334 | 0 |
| 0.8652777777777777 | 0 |
| 0.8659722222222223 | 0 |
| 0.8666666666666667 | 0 |
| 0.8673611111111111 | 0 |
| 0.8680555555555555 | 0 |
| 0.86875 | 0 |
| 0.8694444444444445 | 0 |
| 0.8701388888888889 | 0 |
| 0.8708333333333332 | 0 |
| 0.8715277777777778 | 0 |
| 0.8722222222222222 | 0 |
| 0.8729166666666667 | 0 |
| 0.873611111111111 | 0 |
| 0.8743055555555556 | 0 |
| 0.875 | 0 |
| 0.8756944444444444 | 0 |
| 0.876388888888889 | 0 |
| 0.8770833333333333 | 0 |
| 0.8777777777777778 | 0 |
| 0.8784722222222222 | 0 |
| 0.8791666666666668 | 0 |
| 0.8798611111111111 | 0 |
| 0.8805555555555555 | 0 |
| 0.88125 | 0 |
| 0.8819444444444445 | 0 |
| 0.8826388888888889 | 0 |
| 0.8833333333333333 | 0 |
| 0.8840277777777777 | 0 |
| 0.8847222222222223 | 0 |
| 0.8854166666666666 | 0 |
| 0.8861111111111111 | 0 |
| 0.8868055555555556 | 0 |
| 0.8875000000000001 | 0 |
| 0.8881944444444444 | 0 |
| 0.8888888888888888 | 0 |
| 0.8895833333333334 | 0 |
| 0.8902777777777778 | 0 |
| 0.8909722222222222 | 0 |
| 0.8916666666666666 | 0 |
| 0.8923611111111112 | 0 |
| 0.8930555555555556 | 0 |
| 0.8937499999999999 | 0 |
| 0.8944444444444444 | 0 |
| 0.8951388888888889 | 0 |
| 0.8958333333333334 | 0 |
| 0.8965277777777777 | 0 |
| 0.8972222222222223 | 0 |
| 0.8979166666666667 | 0 |
| 0.8986111111111111 | 0 |
| 0.8993055555555555 | 0 |
| 0.9 | 0 |
| 0.9006944444444445 | 0 |
| 0.9013888888888889 | 0 |
| 0.9020833333333332 | 0 |
| 0.9027777777777778 | 0 |
| 0.9034722222222222 | 0 |
| 0.9041666666666667 | 0 |
| 0.904861111111111 | 0 |
| 0.9055555555555556 | 0 |
| 0.90625 | 0 |
| 0.9069444444444444 | 0 |
| 0.907638888888889 | 0 |
| 0.9083333333333333 | 0 |
| 0.9090277777777778 | 0 |
| 0.9097222222222222 | 0 |
| 0.9104166666666668 | 0 |
| 0.9111111111111111 | 0 |
| 0.9118055555555555 | 0 |
| 0.9125 | 0 |
| 0.9131944444444445 | 0 |
| 0.9138888888888889 | 0 |
| 0.9145833333333333 | 0 |
| 0.9152777777777777 | 0 |
| 0.9159722222222223 | 0 |
| 0.9166666666666666 | 0 |
| 0.9173611111111111 | 0 |
| 0.9180555555555556 | 0 |
| 0.9187500000000001 | 0 |
| 0.9194444444444444 | 0 |
| 0.9201388888888888 | 0 |
| 0.9208333333333334 | 0 |
| 0.9215277777777778 | 0 |
| 0.9222222222222222 | 0 |
| 0.9229166666666666 | 0 |
| 0.9236111111111112 | 0 |
| 0.9243055555555556 | 0 |
| 0.9249999999999999 | 0 |
| 0.9256944444444444 | 0 |
| 0.9263888888888889 | 0 |
| 0.9270833333333334 | 0 |
| 0.9277777777777777 | 0 |
| 0.9284722222222223 | 0 |
| 0.9291666666666667 | 0 |
| 0.9298611111111111 | 0 |
| 0.9305555555555555 | 0 |
| 0.93125 | 0 |
| 0.9319444444444445 | 0 |
| 0.9326388888888889 | 0 |
| 0.9333333333333332 | 0 |
| 0.9340277777777778 | 0 |
| 0.9347222222222222 | 0 |
| 0.9354166666666667 | 0 |
| 0.936111111111111 | 0 |
| 0.9368055555555556 | 0 |
| 0.9375 | 0 |
| 0.9381944444444444 | 0 |
| 0.938888888888889 | 0 |
| 0.9395833333333333 | 0 |
| 0.9402777777777778 | 0 |
| 0.9409722222222222 | 0 |
| 0.9416666666666668 | 0 |
| 0.9423611111111111 | 0 |
| 0.9430555555555555 | 0 |
| 0.94375 | 0 |
| 0.9444444444444445 | 0 |
| 0.9451388888888889 | 0 |
| 0.9458333333333333 | 0 |
| 0.9465277777777777 | 0 |
| 0.9472222222222223 | 0 |
| 0.9479166666666666 | 0 |
| 0.9486111111111111 | 0 |
| 0.9493055555555556 | 0 |
| 0.9500000000000001 | 0 |
| 0.9506944444444444 | 0 |
| 0.9513888888888888 | 0 |
| 0.9520833333333334 | 0 |
| 0.9527777777777778 | 0 |
| 0.9534722222222222 | 0 |
| 0.9541666666666666 | 0 |
| 0.9548611111111112 | 0 |
| 0.9555555555555556 | 0 |
| 0.9562499999999999 | 0 |
| 0.9569444444444444 | 0 |
| 0.9576388888888889 | 0 |
| 0.9583333333333334 | 0 |
| 0.9590277777777777 | 0 |
| 0.9597222222222223 | 0 |
| 0.9604166666666667 | 0 |
| 0.9611111111111111 | 0 |
| 0.9618055555555555 | 0 |
| 0.9625 | 0 |
| 0.9631944444444445 | 0 |
| 0.9638888888888889 | 0 |
| 0.9645833333333332 | 0 |
| 0.9652777777777778 | 0 |
| 0.9659722222222222 | 0 |
| 0.9666666666666667 | 0 |
| 0.967361111111111 | 0 |
| 0.9680555555555556 | 0 |
| 0.96875 | 0 |
| 0.9694444444444444 | 0 |
| 0.970138888888889 | 0 |
| 0.9708333333333333 | 0 |
| 0.9715277777777778 | 0 |
| 0.9722222222222222 | 0 |
| 0.9729166666666668 | 0 |
| 0.9736111111111111 | 0 |
| 0.9743055555555555 | 0 |
| 0.975 | 0 |
| 0.9756944444444445 | 0 |
| 0.9763888888888889 | 0 |
| 0.9770833333333333 | 0 |
| 0.9777777777777777 | 0 |
| 0.9784722222222223 | 0 |
| 0.9791666666666666 | 0 |
| 0.9798611111111111 | 0 |
| 0.9805555555555556 | 0 |
| 0.9812500000000001 | 0 |
| 0.9819444444444444 | 0 |
| 0.9826388888888888 | 0 |
| 0.9833333333333334 | 0 |
| 0.9840277777777778 | 0 |
| 0.9847222222222222 | 0 |
| 0.9854166666666666 | 0 |
| 0.9861111111111112 | 0 |
| 0.9868055555555556 | 0 |
| 0.9874999999999999 | 0 |
| 0.9881944444444444 | 0 |
| 0.9888888888888889 | 0 |
| 0.9895833333333334 | 0 |
| 0.9902777777777777 | 0 |
| 0.9909722222222223 | 0 |
| 0.9916666666666667 | 0 |
| 0.9923611111111111 | 0 |
| 0.9930555555555555 | 0 |
| 0.99375 | 0 |
| 0.9944444444444445 | 0 |
| 0.9951388888888889 | 0 |
| 0.9958333333333332 | 0 |
| 0.9965277777777778 | 0 |
| 0.9972222222222222 | 0 |
| 0.9979166666666667 | 0 |
| 0.998611111111111 | 0 |
| 0.9993055555555556 | 0 |